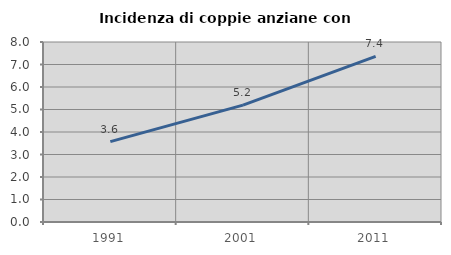
| Category | Incidenza di coppie anziane con figli |
|---|---|
| 1991.0 | 3.573 |
| 2001.0 | 5.194 |
| 2011.0 | 7.361 |